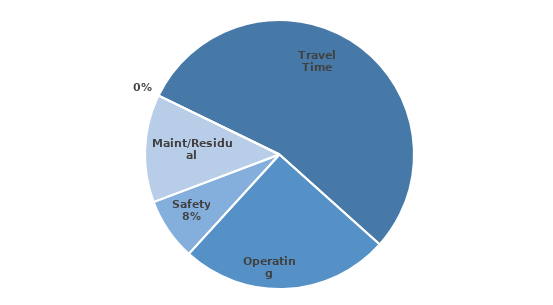
| Category | Series 0 |
|---|---|
| Travel Time | 110870428.055 |
| Operating | 51217582.378 |
| Safety | 15220300.419 |
| Maint/Residual | 26435088.291 |